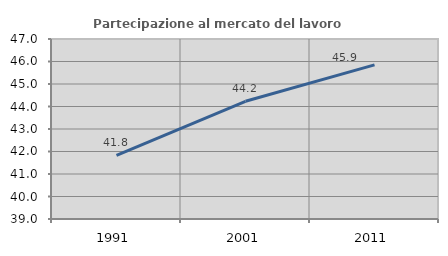
| Category | Partecipazione al mercato del lavoro  femminile |
|---|---|
| 1991.0 | 41.825 |
| 2001.0 | 44.232 |
| 2011.0 | 45.852 |